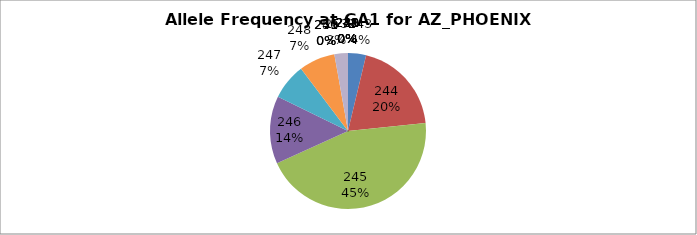
| Category | Series 0 |
|---|---|
| 221.0 | 0 |
| 238.0 | 0 |
| 239.0 | 0 |
| 240.0 | 0 |
| 241.0 | 0 |
| 242.0 | 0 |
| 243.0 | 0.037 |
| 244.0 | 0.196 |
| 245.0 | 0.449 |
| 246.0 | 0.14 |
| 247.0 | 0.075 |
| 248.0 | 0.075 |
| 249.0 | 0 |
| 250.0 | 0 |
| 251.0 | 0 |
| 253.0 | 0.028 |